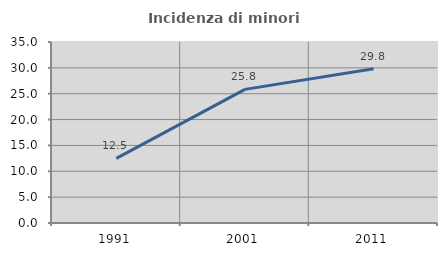
| Category | Incidenza di minori stranieri |
|---|---|
| 1991.0 | 12.5 |
| 2001.0 | 25.843 |
| 2011.0 | 29.837 |